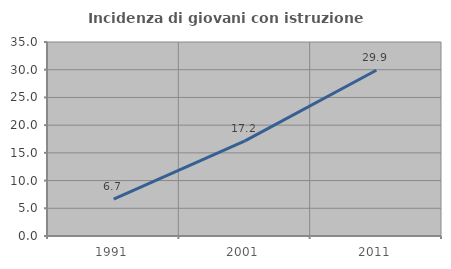
| Category | Incidenza di giovani con istruzione universitaria |
|---|---|
| 1991.0 | 6.667 |
| 2001.0 | 17.164 |
| 2011.0 | 29.911 |